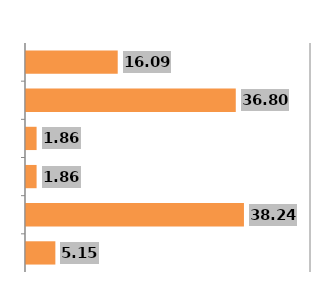
| Category | Series 0 |
|---|---|
| 0 | 5.151 |
| 1 | 38.237 |
| 2 | 1.859 |
| 3 | 1.859 |
| 4 | 36.803 |
| 5 | 16.091 |